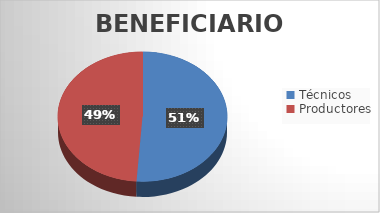
| Category | Series 0 |
|---|---|
| Técnicos | 113 |
| Productores | 108 |